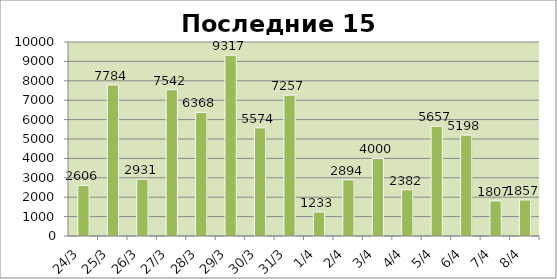
| Category | Series 0 |
|---|---|
| 2010-03-25 | 7784 |
| 2010-03-26 | 2931 |
| 2010-03-27 | 7542 |
| 2010-03-28 | 6368 |
| 2010-03-29 | 9317 |
| 2010-03-30 | 5574 |
| 2010-03-31 | 7257 |
| 2010-04-01 | 1233 |
| 2010-04-02 | 2894 |
| 2010-04-03 | 4000 |
| 2010-04-04 | 2382 |
| 2010-04-05 | 5657 |
| 2010-04-06 | 5198 |
| 2010-04-07 | 1807 |
| 2010-04-08 | 1857 |